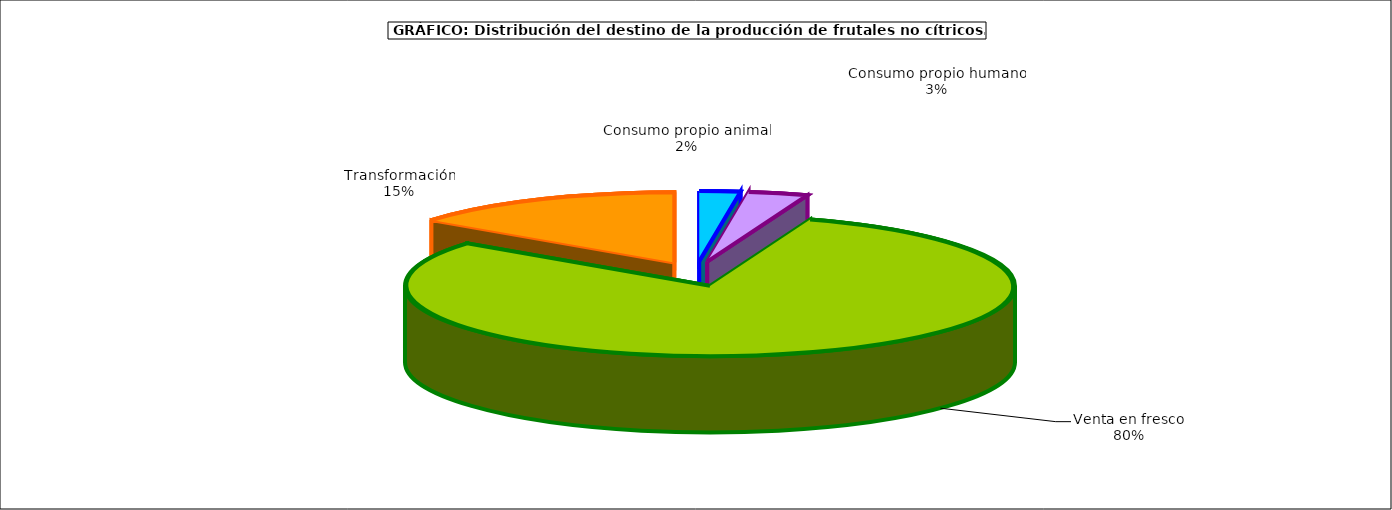
| Category | frutales no cítricos |
|---|---|
| 0 | 76362 |
| 1 | 111669 |
| 2 | 2826261 |
| 3 | 517791 |